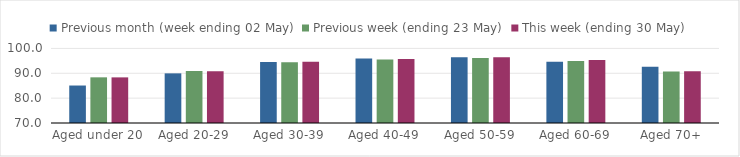
| Category | Previous month (week ending 02 May) | Previous week (ending 23 May) | This week (ending 30 May) |
|---|---|---|---|
| Aged under 20 | 85.079 | 88.37 | 88.353 |
| Aged 20-29 | 89.971 | 90.901 | 90.816 |
| Aged 30-39 | 94.573 | 94.463 | 94.605 |
| Aged 40-49 | 95.965 | 95.531 | 95.783 |
| Aged 50-59 | 96.457 | 96.157 | 96.481 |
| Aged 60-69 | 94.633 | 94.987 | 95.324 |
| Aged 70+ | 92.581 | 90.708 | 90.865 |